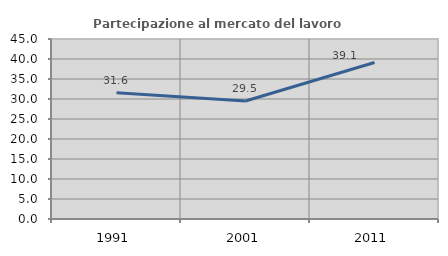
| Category | Partecipazione al mercato del lavoro  femminile |
|---|---|
| 1991.0 | 31.579 |
| 2001.0 | 29.508 |
| 2011.0 | 39.13 |